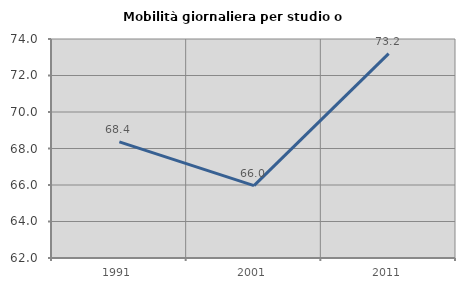
| Category | Mobilità giornaliera per studio o lavoro |
|---|---|
| 1991.0 | 68.366 |
| 2001.0 | 65.967 |
| 2011.0 | 73.195 |